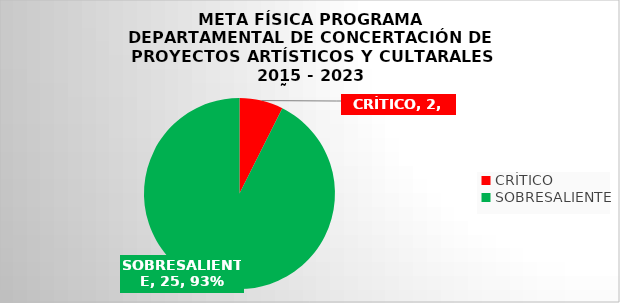
| Category | Series 0 |
|---|---|
| CRÍTICO | 2 |
| SOBRESALIENTE | 25 |